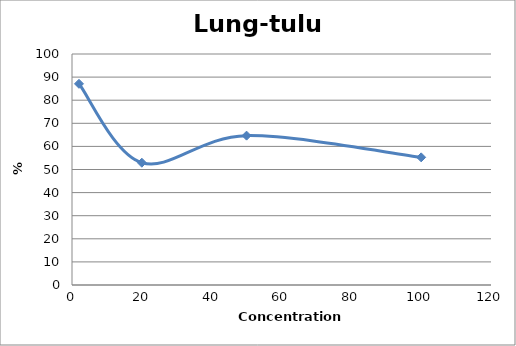
| Category | Lung-tulu4 |
|---|---|
| 100.0 | 55.26 |
| 50.0 | 64.654 |
| 20.0 | 52.939 |
| 2.0 | 87.099 |
| nan | 0 |
| nan | 0 |
| nan | 0 |
| nan | 0 |
| nan | 0 |